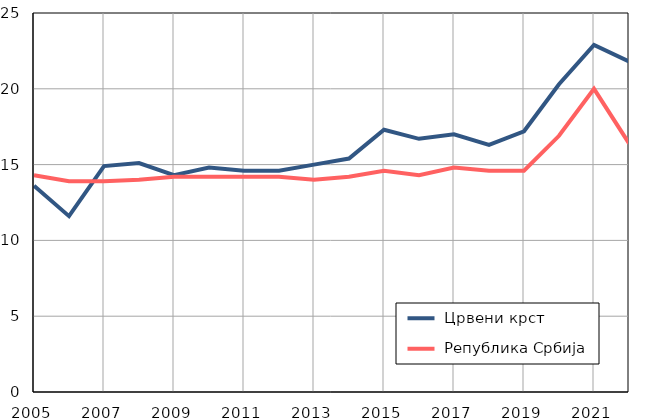
| Category |  Црвени крст |  Република Србија |
|---|---|---|
| 2005.0 | 13.6 | 14.3 |
| 2006.0 | 11.6 | 13.9 |
| 2007.0 | 14.9 | 13.9 |
| 2008.0 | 15.1 | 14 |
| 2009.0 | 14.3 | 14.2 |
| 2010.0 | 14.8 | 14.2 |
| 2011.0 | 14.6 | 14.2 |
| 2012.0 | 14.6 | 14.2 |
| 2013.0 | 15 | 14 |
| 2014.0 | 15.4 | 14.2 |
| 2015.0 | 17.3 | 14.6 |
| 2016.0 | 16.7 | 14.3 |
| 2017.0 | 17 | 14.8 |
| 2018.0 | 16.3 | 14.6 |
| 2019.0 | 17.2 | 14.6 |
| 2020.0 | 20.3 | 16.9 |
| 2021.0 | 22.9 | 20 |
| 2022.0 | 21.8 | 16.4 |